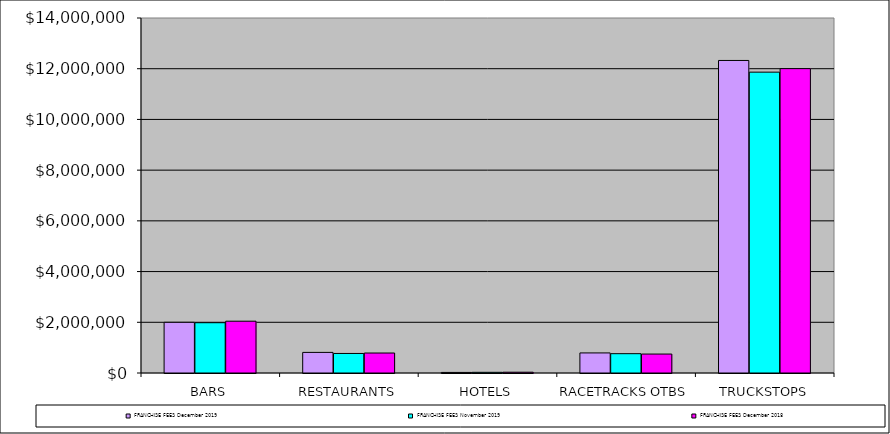
| Category | FRANCHISE FEES |
|---|---|
| BARS | 2043015 |
| RESTAURANTS | 788112 |
| HOTELS | 31309 |
| RACETRACKS OTBS | 746984 |
| TRUCKSTOPS | 12003975 |